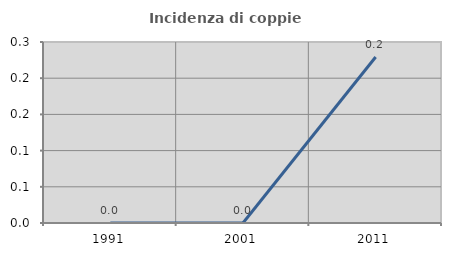
| Category | Incidenza di coppie miste |
|---|---|
| 1991.0 | 0 |
| 2001.0 | 0 |
| 2011.0 | 0.229 |